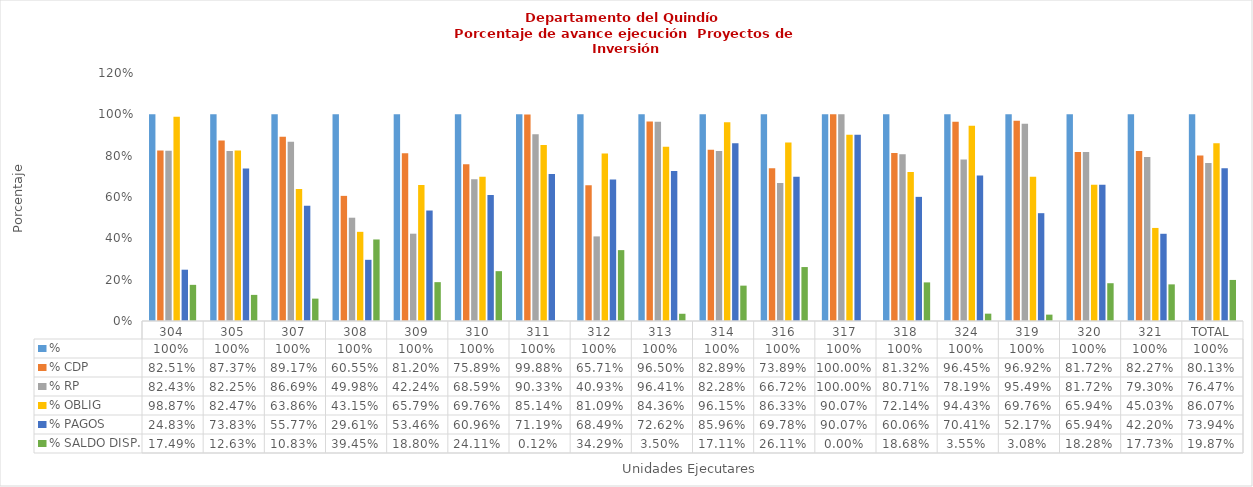
| Category | % | % CDP | % RP | % OBLIG | % PAGOS | % SALDO DISP. |
|---|---|---|---|---|---|---|
| 304 | 1 | 0.825 | 0.824 | 0.989 | 0.248 | 0.175 |
| 305 | 1 | 0.874 | 0.822 | 0.825 | 0.738 | 0.126 |
| 307 | 1 | 0.892 | 0.867 | 0.639 | 0.558 | 0.108 |
| 308 | 1 | 0.605 | 0.5 | 0.431 | 0.296 | 0.395 |
| 309 | 1 | 0.812 | 0.422 | 0.658 | 0.535 | 0.188 |
| 310 | 1 | 0.759 | 0.686 | 0.698 | 0.61 | 0.241 |
| 311 | 1 | 0.999 | 0.903 | 0.851 | 0.712 | 0.001 |
| 312 | 1 | 0.657 | 0.409 | 0.811 | 0.685 | 0.343 |
| 313 | 1 | 0.965 | 0.964 | 0.844 | 0.726 | 0.035 |
| 314 | 1 | 0.829 | 0.823 | 0.962 | 0.86 | 0.171 |
| 316 | 1 | 0.739 | 0.667 | 0.863 | 0.698 | 0.261 |
| 317 | 1 | 1 | 1 | 0.901 | 0.901 | 0 |
| 318 | 1 | 0.813 | 0.807 | 0.721 | 0.601 | 0.187 |
| 324 | 1 | 0.964 | 0.782 | 0.944 | 0.704 | 0.036 |
| 319 | 1 | 0.969 | 0.955 | 0.698 | 0.522 | 0.031 |
| 320 | 1 | 0.817 | 0.817 | 0.659 | 0.659 | 0.183 |
| 321 | 1 | 0.823 | 0.793 | 0.45 | 0.422 | 0.177 |
| TOTAL | 1 | 0.801 | 0.765 | 0.861 | 0.739 | 0.199 |